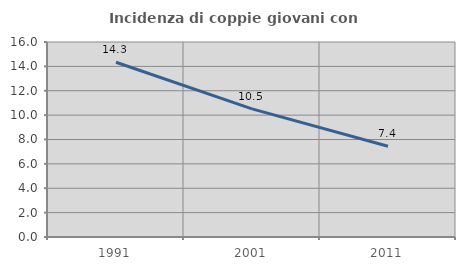
| Category | Incidenza di coppie giovani con figli |
|---|---|
| 1991.0 | 14.338 |
| 2001.0 | 10.512 |
| 2011.0 | 7.447 |